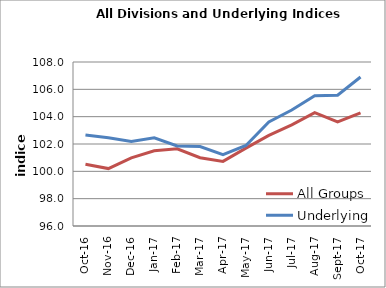
| Category | All Groups | Underlying |
|---|---|---|
| 2016-10-01 | 100.517 | 102.66 |
| 2016-11-01 | 100.201 | 102.451 |
| 2016-12-01 | 100.991 | 102.18 |
| 2017-01-01 | 101.51 | 102.449 |
| 2017-02-01 | 101.644 | 101.858 |
| 2017-03-01 | 100.999 | 101.809 |
| 2017-04-01 | 100.727 | 101.214 |
| 2017-05-01 | 101.699 | 101.894 |
| 2017-06-01 | 102.633 | 103.613 |
| 2017-07-01 | 103.397 | 104.483 |
| 2017-08-01 | 104.291 | 105.536 |
| 2017-09-01 | 103.612 | 105.565 |
| 2017-10-01 | 104.27 | 106.905 |